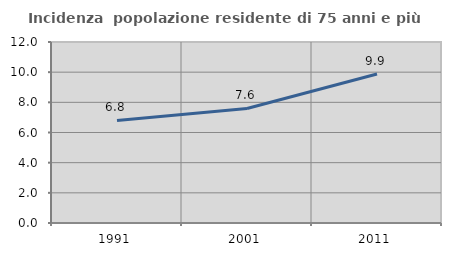
| Category | Incidenza  popolazione residente di 75 anni e più |
|---|---|
| 1991.0 | 6.799 |
| 2001.0 | 7.595 |
| 2011.0 | 9.877 |